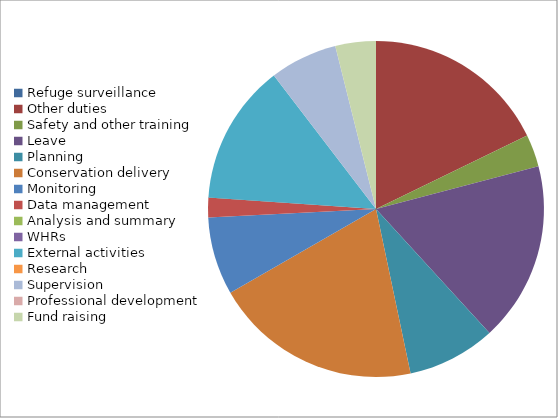
| Category | Series 0 |
|---|---|
| Refuge surveillance | 0 |
| Other duties | 17.8 |
| Safety and other training | 3.1 |
| Leave | 17.3 |
| Planning | 8.5 |
| Conservation delivery | 20 |
| Monitoring | 7.5 |
| Data management | 1.9 |
| Analysis and summary | 0 |
| WHRs | 0 |
| External activities | 13.5 |
| Research | 0 |
| Supervision | 6.5 |
| Professional development | 0 |
| Fund raising | 3.9 |